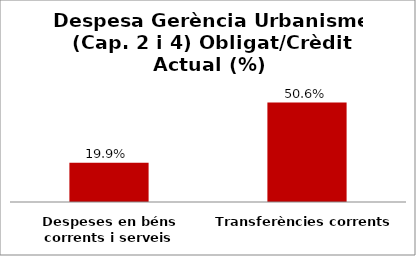
| Category | Series 0 |
|---|---|
| Despeses en béns corrents i serveis | 0.199 |
| Transferències corrents | 0.506 |